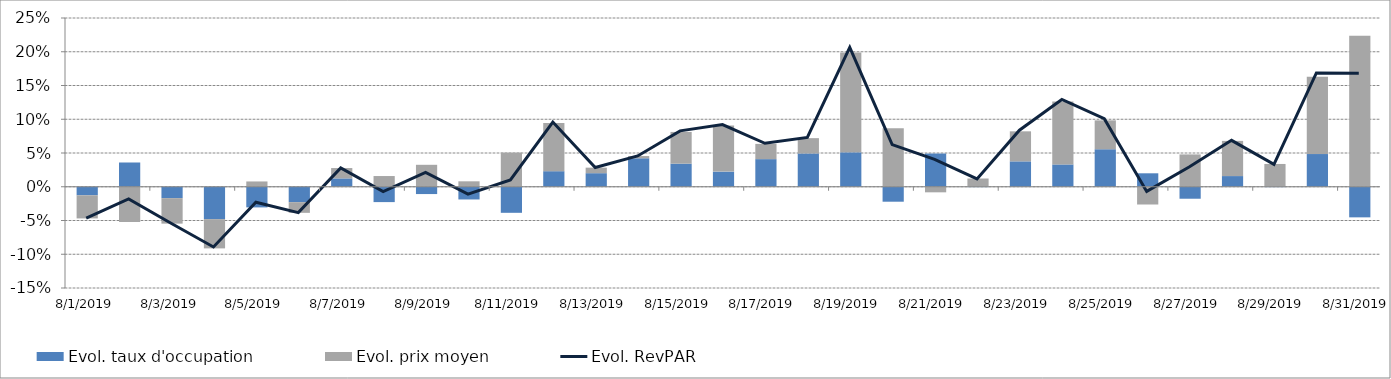
| Category | Evol. taux d'occupation | Evol. prix moyen |
|---|---|---|
| 8/1/19 | -0.013 | -0.034 |
| 8/2/19 | 0.036 | -0.052 |
| 8/3/19 | -0.017 | -0.038 |
| 8/4/19 | -0.048 | -0.043 |
| 8/5/19 | -0.031 | 0.008 |
| 8/6/19 | -0.023 | -0.016 |
| 8/7/19 | 0.012 | 0.015 |
| 8/8/19 | -0.023 | 0.016 |
| 8/9/19 | -0.011 | 0.033 |
| 8/10/19 | -0.019 | 0.008 |
| 8/11/19 | -0.039 | 0.051 |
| 8/12/19 | 0.023 | 0.071 |
| 8/13/19 | 0.02 | 0.008 |
| 8/14/19 | 0.042 | 0.003 |
| 8/15/19 | 0.034 | 0.047 |
| 8/16/19 | 0.022 | 0.068 |
| 8/17/19 | 0.041 | 0.023 |
| 8/18/19 | 0.049 | 0.023 |
| 8/19/19 | 0.051 | 0.148 |
| 8/20/19 | -0.022 | 0.087 |
| 8/21/19 | 0.049 | -0.008 |
| 8/22/19 | -0.001 | 0.012 |
| 8/23/19 | 0.038 | 0.044 |
| 8/24/19 | 0.033 | 0.093 |
| 8/25/19 | 0.056 | 0.043 |
| 8/26/19 | 0.02 | -0.026 |
| 8/27/19 | -0.018 | 0.048 |
| 8/28/19 | 0.016 | 0.052 |
| 8/29/19 | -0.001 | 0.034 |
| 8/30/19 | 0.048 | 0.115 |
| 8/31/19 | -0.045 | 0.224 |